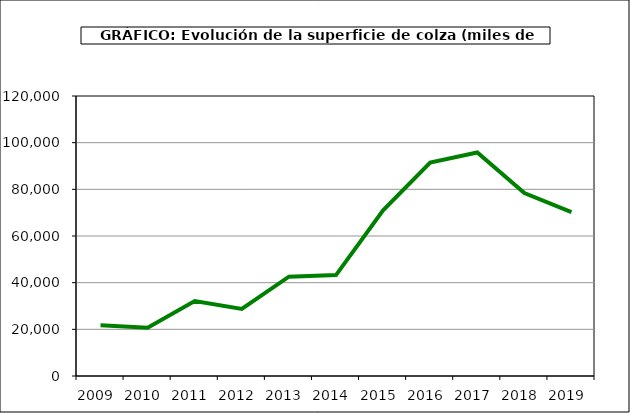
| Category | Superficie |
|---|---|
| 2009.0 | 21740 |
| 2010.0 | 20731 |
| 2011.0 | 32091 |
| 2012.0 | 28757 |
| 2013.0 | 42549 |
| 2014.0 | 43244 |
| 2015.0 | 71040 |
| 2016.0 | 91459 |
| 2017.0 | 95801 |
| 2018.0 | 78401 |
| 2019.0 | 70255 |